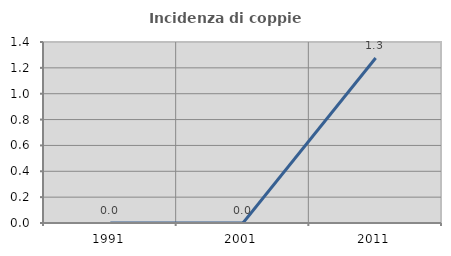
| Category | Incidenza di coppie miste |
|---|---|
| 1991.0 | 0 |
| 2001.0 | 0 |
| 2011.0 | 1.277 |